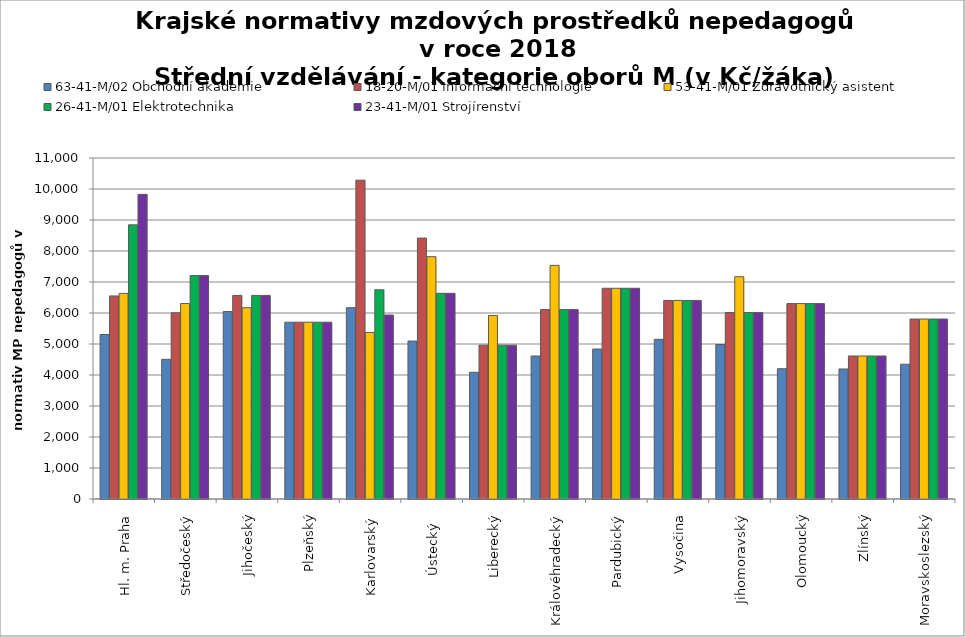
| Category | 63-41-M/02 Obchodní akademie | 18-20-M/01 Informační technologie | 53-41-M/01 Zdravotnický asistent | 26-41-M/01 Elektrotechnika | 23-41-M/01 Strojírenství |
|---|---|---|---|---|---|
| Hl. m. Praha | 5306.4 | 6551.111 | 6633 | 8844 | 9826.667 |
| Středočeský | 4504.714 | 6006.286 | 6306.6 | 7207.543 | 7207.543 |
| Jihočeský | 6048.316 | 6566.743 | 6170.389 | 6566.743 | 6566.743 |
| Plzeňský | 5703.429 | 5703.429 | 5703.429 | 5703.429 | 5703.429 |
| Karlovarský  | 6171.429 | 10285.714 | 5373.134 | 6750 | 5934.066 |
| Ústecký   | 5093.895 | 8416.614 | 7816.752 | 6634.612 | 6634.612 |
| Liberecký | 4086.831 | 4962.902 | 5918.71 | 4962.902 | 4962.902 |
| Královéhradecký | 4613.36 | 6109.384 | 7535.92 | 6109.384 | 6109.384 |
| Pardubický | 4837.154 | 6798.162 | 6798.162 | 6798.162 | 6798.162 |
| Vysočina | 5150.507 | 6404.933 | 6404.933 | 6404.933 | 6404.933 |
| Jihomoravský | 4984.985 | 6014.493 | 7169.594 | 6014.493 | 6014.493 |
| Olomoucký | 4202.543 | 6303.814 | 6303.814 | 6303.814 | 6303.814 |
| Zlínský | 4194.109 | 4613.52 | 4613.52 | 4613.52 | 4613.52 |
| Moravskoslezský | 4348.023 | 5805.381 | 5805.381 | 5805.381 | 5805.381 |